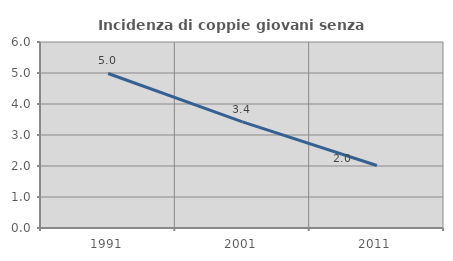
| Category | Incidenza di coppie giovani senza figli |
|---|---|
| 1991.0 | 4.984 |
| 2001.0 | 3.423 |
| 2011.0 | 2.017 |